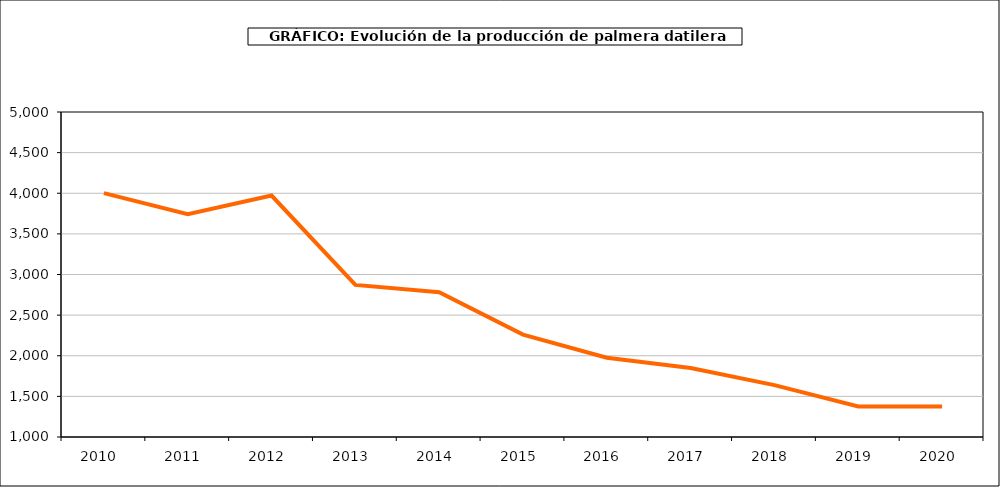
| Category | producción kiwi |
|---|---|
| 2010.0 | 4002 |
| 2011.0 | 3741 |
| 2012.0 | 3972 |
| 2013.0 | 2872 |
| 2014.0 | 2781 |
| 2015.0 | 2260 |
| 2016.0 | 1975 |
| 2017.0 | 1848 |
| 2018.0 | 1638 |
| 2019.0 | 1375 |
| 2020.0 | 1375 |